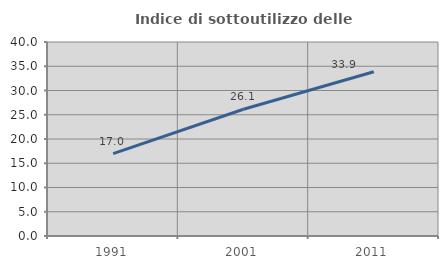
| Category | Indice di sottoutilizzo delle abitazioni  |
|---|---|
| 1991.0 | 16.986 |
| 2001.0 | 26.126 |
| 2011.0 | 33.867 |